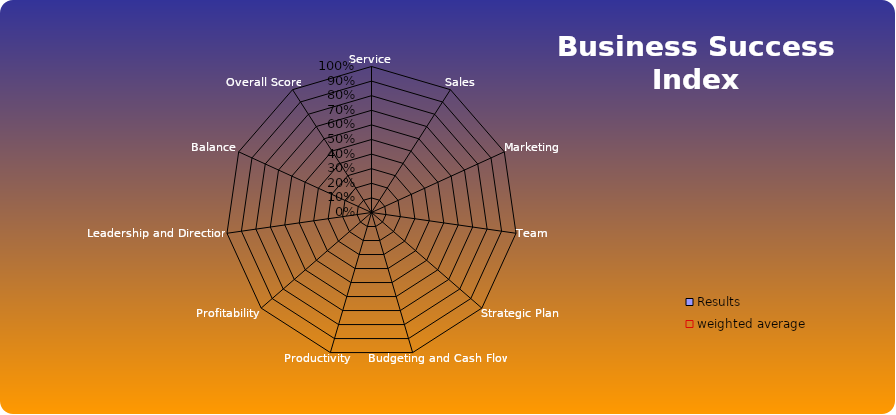
| Category | Results | weighted average |
|---|---|---|
| Service | 0 | 0 |
| Sales | 0 | 0 |
| Marketing | 0 | 0 |
| Team | 0 | 0 |
| Strategic Plan | 0 | 0 |
| Budgeting and Cash Flow | 0 | 0 |
| Productivity | 0 | 0 |
| Profitability | 0 | 0 |
| Leadership and Direction | 0 | 0 |
| Balance | 0 | 0 |
| Overall Score | 0 | 0 |